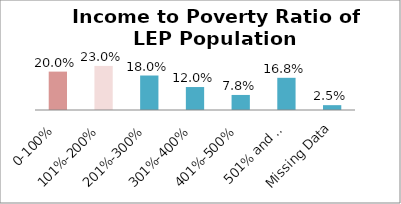
| Category | Percent |
|---|---|
| 0-100% | 0.2 |
| 101%-200% | 0.23 |
| 201%-300% | 0.18 |
| 301%-400% | 0.12 |
| 401%-500% | 0.078 |
| 501% and Over | 0.168 |
| Missing Data | 0.025 |